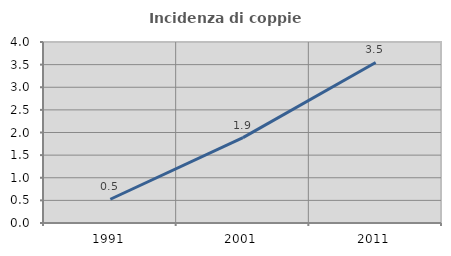
| Category | Incidenza di coppie miste |
|---|---|
| 1991.0 | 0.525 |
| 2001.0 | 1.887 |
| 2011.0 | 3.548 |